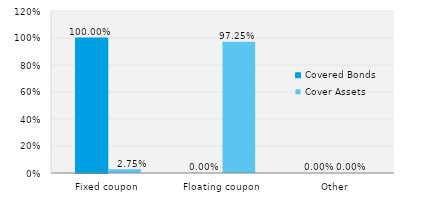
| Category | Covered Bonds | Cover Assets |
|---|---|---|
| Fixed coupon | 1 | 0.027 |
| Floating coupon | 0 | 0.973 |
| Other | 0 | 0 |